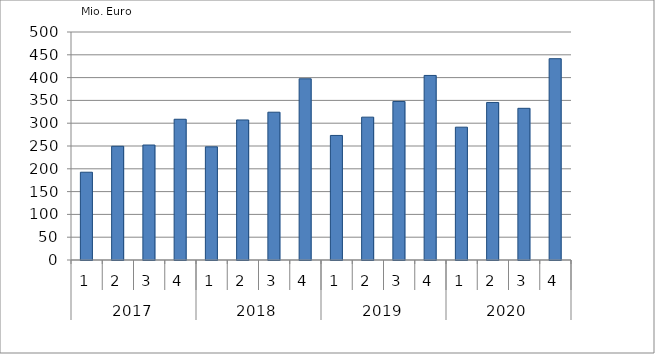
| Category | Ausbaugewerblicher Umsatz3 |
|---|---|
| 0 | 192499.539 |
| 1 | 249394.388 |
| 2 | 252146.755 |
| 3 | 308653.153 |
| 4 | 248133.418 |
| 5 | 307099.899 |
| 6 | 324088.989 |
| 7 | 397377.201 |
| 8 | 273159.137 |
| 9 | 313254.251 |
| 10 | 347631.281 |
| 11 | 404721.054 |
| 12 | 291272.144 |
| 13 | 345494.215 |
| 14 | 332629.265 |
| 15 | 441463.36 |